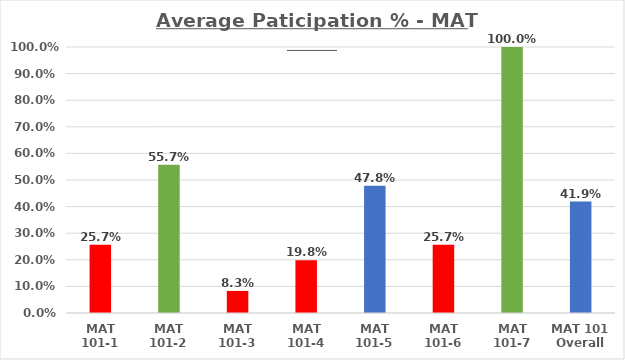
| Category | Average Paticipation % - MAT 101s |
|---|---|
| MAT 101-1 | 0.257 |
| MAT 101-2 | 0.557 |
| MAT 101-3 | 0.083 |
| MAT 101-4 | 0.198 |
| MAT 101-5 | 0.478 |
| MAT 101-6 | 0.257 |
| MAT 101-7 | 1 |
| MAT 101 Overall | 0.419 |